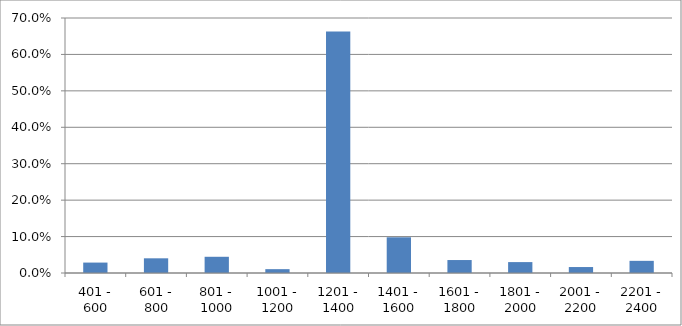
| Category | Series 0 |
|---|---|
| 401 - 600 | 0.029 |
| 601 - 800 | 0.04 |
| 801 - 1000 | 0.045 |
| 1001 - 1200 | 0.011 |
| 1201 - 1400 | 0.663 |
| 1401 - 1600 | 0.098 |
| 1601 - 1800 | 0.036 |
| 1801 - 2000 | 0.03 |
| 2001 - 2200 | 0.016 |
| 2201 - 2400 | 0.033 |